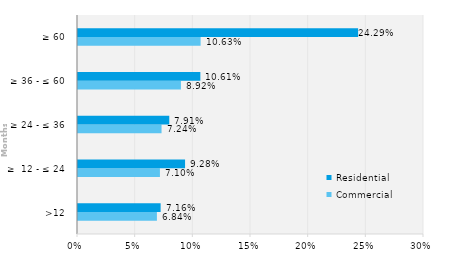
| Category | Commercial | Residential |
|---|---|---|
| >12 | 0.068 | 0.072 |
| ≥  12 - ≤ 24 | 0.071 | 0.093 |
| ≥ 24 - ≤ 36 | 0.072 | 0.079 |
| ≥ 36 - ≤ 60 | 0.089 | 0.106 |
| ≥ 60 | 0.106 | 0.243 |